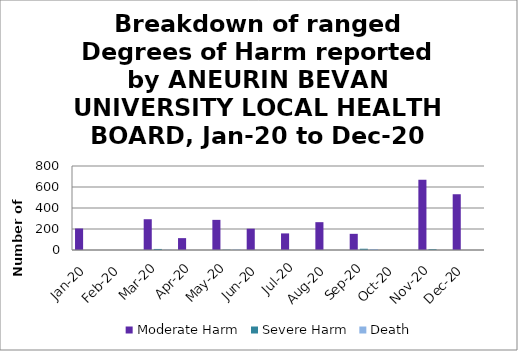
| Category | Moderate Harm | Severe Harm | Death |
|---|---|---|---|
| Jan-20 | 205 | 0 | 0 |
| Feb-20 | 0 | 0 | 0 |
| Mar-20 | 293 | 10 | 3 |
| Apr-20 | 113 | 0 | 0 |
| May-20 | 287 | 3 | 5 |
| Jun-20 | 203 | 0 | 0 |
| Jul-20 | 158 | 0 | 0 |
| Aug-20 | 265 | 0 | 0 |
| Sep-20 | 154 | 12 | 9 |
| Oct-20 | 0 | 0 | 0 |
| Nov-20 | 669 | 8 | 0 |
| Dec-20 | 531 | 0 | 0 |